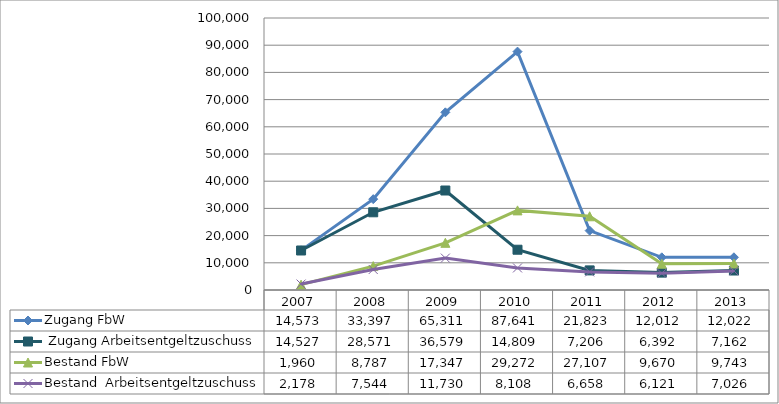
| Category | Zugang FbW |  Zugang Arbeitsentgeltzuschuss | Bestand FbW | Bestand  Arbeitsentgeltzuschuss |
|---|---|---|---|---|
| 2007.0 | 14573 | 14527 | 1960 | 2178 |
| 2008.0 | 33397 | 28571 | 8787 | 7544 |
| 2009.0 | 65311 | 36579 | 17347 | 11730 |
| 2010.0 | 87641 | 14809 | 29272 | 8108 |
| 2011.0 | 21823 | 7206 | 27107 | 6658 |
| 2012.0 | 12012 | 6392 | 9670 | 6121 |
| 2013.0 | 12022 | 7162 | 9743 | 7026 |